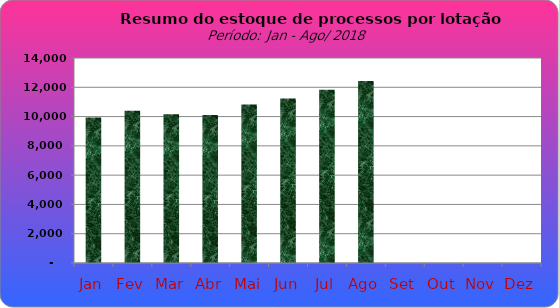
| Category | Series 0 |
|---|---|
| Jan | 9933 |
| Fev | 10393 |
| Mar | 10166 |
| Abr | 10112 |
| Mai | 10819 |
| Jun | 11230 |
| Jul | 11829 |
| Ago | 12430 |
| Set | 0 |
| Out | 0 |
| Nov | 0 |
| Dez | 0 |